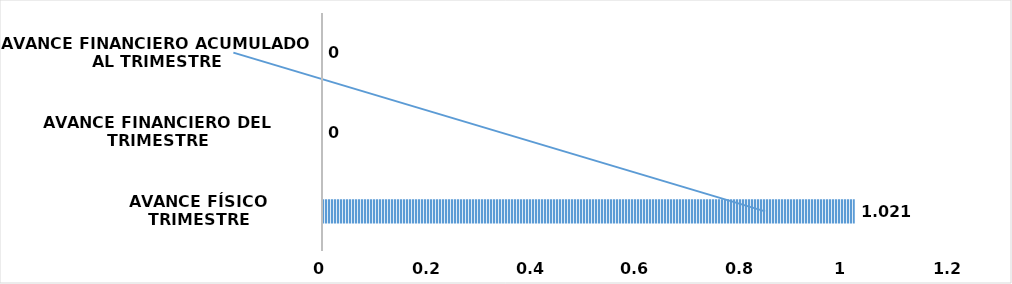
| Category | Series 0 |
|---|---|
| AVANCE FÍSICO TRIMESTRE | 1.021 |
| AVANCE FINANCIERO DEL TRIMESTRE | 0 |
| AVANCE FINANCIERO ACUMULADO AL TRIMESTRE | 0 |